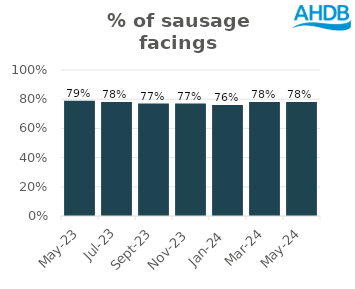
| Category | Sausage |
|---|---|
| 2023-05-01 | 0.79 |
| 2023-07-01 | 0.78 |
| 2023-09-01 | 0.77 |
| 2023-11-01 | 0.77 |
| 2024-01-01 | 0.76 |
| 2024-03-01 | 0.78 |
| 2024-05-01 | 0.78 |